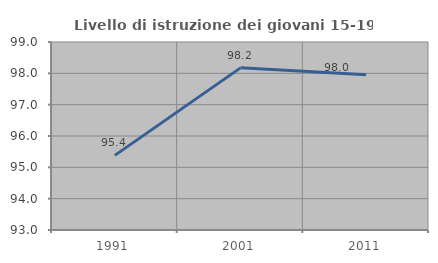
| Category | Livello di istruzione dei giovani 15-19 anni |
|---|---|
| 1991.0 | 95.382 |
| 2001.0 | 98.174 |
| 2011.0 | 97.956 |